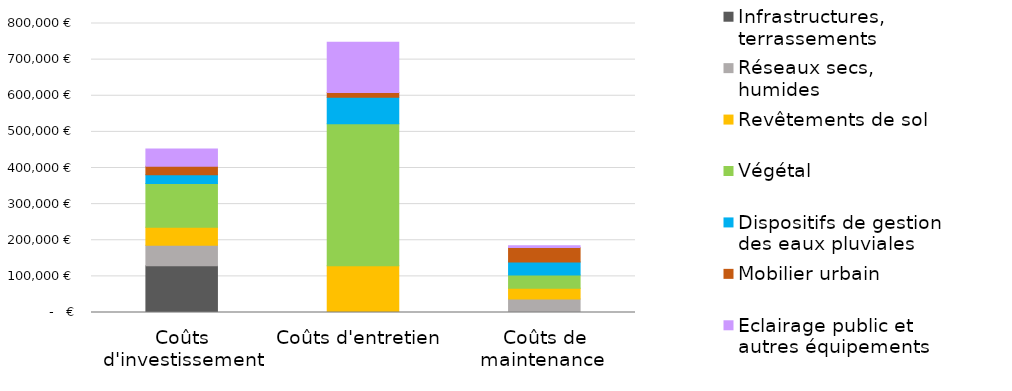
| Category | Infrastructures, terrassements | Réseaux secs, humides | Revêtements de sol  | Végétal | Dispositifs de gestion des eaux pluviales | Mobilier urbain | Eclairage public et autres équipements |
|---|---|---|---|---|---|---|---|
| Coûts d'investissement | 129500 | 57000 | 49500 | 120800 | 24500 | 23220 | 47900 |
| Coûts d'entretien  | 0 | 420 | 129000 | 393000 | 73200 | 13650 | 138900 |
| Coûts de maintenance  | 0 | 37200 | 30150 | 36450 | 36000 | 40425.9 | 4500.39 |